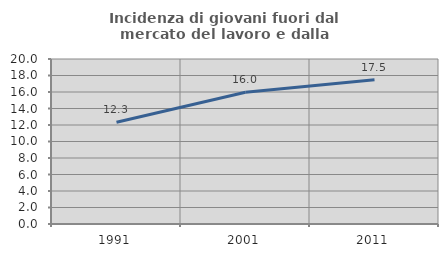
| Category | Incidenza di giovani fuori dal mercato del lavoro e dalla formazione  |
|---|---|
| 1991.0 | 12.334 |
| 2001.0 | 15.971 |
| 2011.0 | 17.476 |